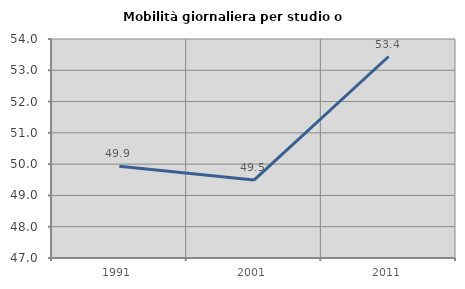
| Category | Mobilità giornaliera per studio o lavoro |
|---|---|
| 1991.0 | 49.934 |
| 2001.0 | 49.491 |
| 2011.0 | 53.441 |